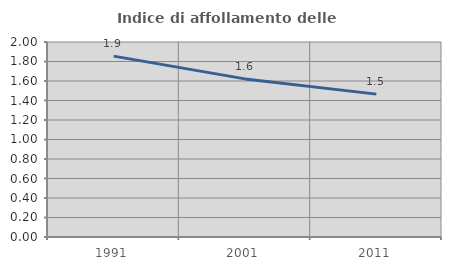
| Category | Indice di affollamento delle abitazioni  |
|---|---|
| 1991.0 | 1.855 |
| 2001.0 | 1.622 |
| 2011.0 | 1.465 |